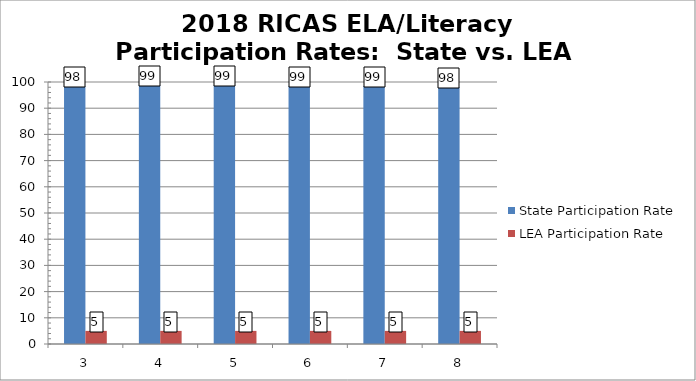
| Category | State Participation Rate | LEA Participation Rate |
|---|---|---|
| 3.0 | 98.4 | 5 |
| 4.0 | 98.8 | 5 |
| 5.0 | 98.8 | 5 |
| 6.0 | 98.5 | 5 |
| 7.0 | 98.5 | 5 |
| 8.0 | 98 | 5 |